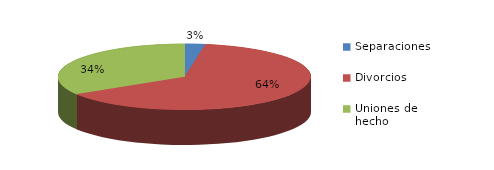
| Category | Series 0 |
|---|---|
| Separaciones | 42 |
| Divorcios | 1020 |
| Uniones de hecho | 544 |